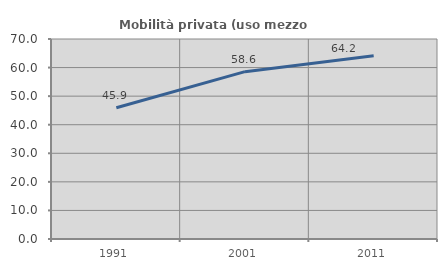
| Category | Mobilità privata (uso mezzo privato) |
|---|---|
| 1991.0 | 45.922 |
| 2001.0 | 58.569 |
| 2011.0 | 64.177 |